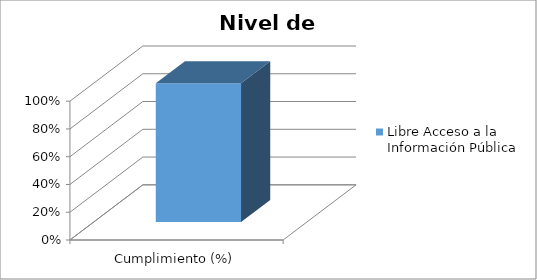
| Category | Libre Acceso a la Información Pública |
|---|---|
| Cumplimiento (%) | 1 |